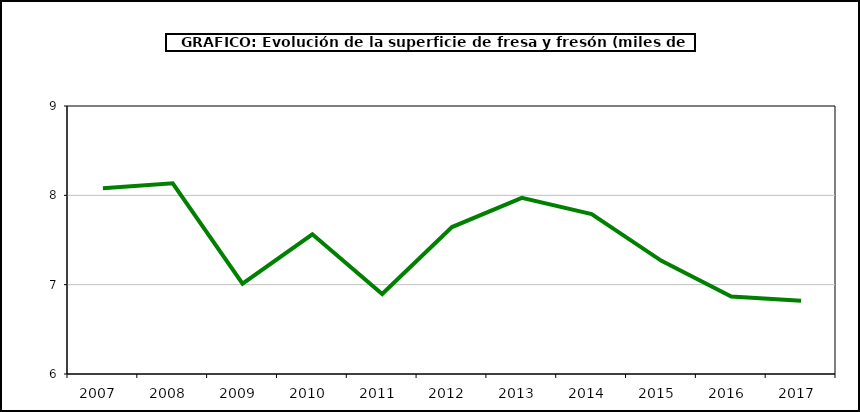
| Category | superficie |
|---|---|
| 2007.0 | 8.078 |
| 2008.0 | 8.134 |
| 2009.0 | 7.011 |
| 2010.0 | 7.564 |
| 2011.0 | 6.896 |
| 2012.0 | 7.645 |
| 2013.0 | 7.972 |
| 2014.0 | 7.791 |
| 2015.0 | 7.267 |
| 2016.0 | 6.867 |
| 2017.0 | 6.819 |